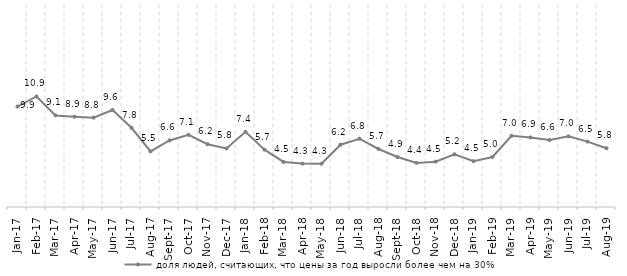
| Category | доля людей, считающих, что цены за год выросли более чем на 30% |
|---|---|
| 2017-01-01 | 9.946 |
| 2017-02-01 | 10.942 |
| 2017-03-01 | 9.066 |
| 2017-04-01 | 8.939 |
| 2017-05-01 | 8.844 |
| 2017-06-01 | 9.6 |
| 2017-07-01 | 7.841 |
| 2017-08-01 | 5.509 |
| 2017-09-01 | 6.587 |
| 2017-10-01 | 7.147 |
| 2017-11-01 | 6.218 |
| 2017-12-01 | 5.8 |
| 2018-01-01 | 7.445 |
| 2018-02-01 | 5.682 |
| 2018-03-01 | 4.463 |
| 2018-04-01 | 4.296 |
| 2018-05-01 | 4.287 |
| 2018-06-01 | 6.164 |
| 2018-07-01 | 6.758 |
| 2018-08-01 | 5.744 |
| 2018-09-01 | 4.946 |
| 2018-10-01 | 4.368 |
| 2018-11-01 | 4.491 |
| 2018-12-01 | 5.219 |
| 2019-01-01 | 4.543 |
| 2019-02-01 | 4.953 |
| 2019-03-01 | 7.044 |
| 2019-04-01 | 6.883 |
| 2019-05-01 | 6.627 |
| 2019-06-01 | 6.991 |
| 2019-07-01 | 6.476 |
| 2019-08-01 | 5.822 |